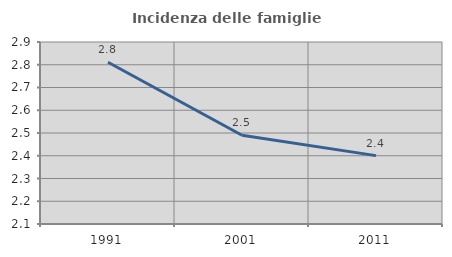
| Category | Incidenza delle famiglie numerose |
|---|---|
| 1991.0 | 2.811 |
| 2001.0 | 2.49 |
| 2011.0 | 2.401 |